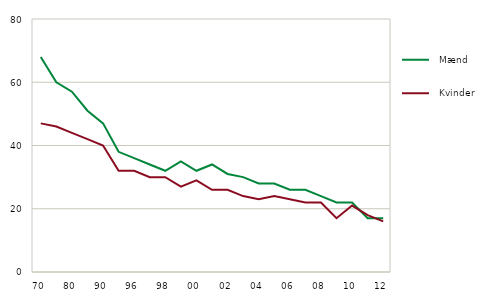
| Category |   Mænd |   Kvinder |
|---|---|---|
| 70 | 68 | 47 |
| 75 | 60 | 46 |
| 80 | 57 | 44 |
| 85 | 51 | 42 |
| 90 | 47 | 40 |
| 95 | 38 | 32 |
| 96 | 36 | 32 |
| 97 | 34 | 30 |
| 98 | 32 | 30 |
| 99 | 35 | 27 |
| 00 | 32 | 29 |
| 01 | 34 | 26 |
| 02 | 31 | 26 |
| 03 | 30 | 24 |
| 04 | 28 | 23 |
| 05 | 28 | 24 |
| 06 | 26 | 23 |
| 07 | 26 | 22 |
| 08 | 24 | 22 |
| 09 | 22 | 17 |
| 10 | 22 | 21 |
| 11 | 17 | 18 |
| 12 | 17 | 16 |